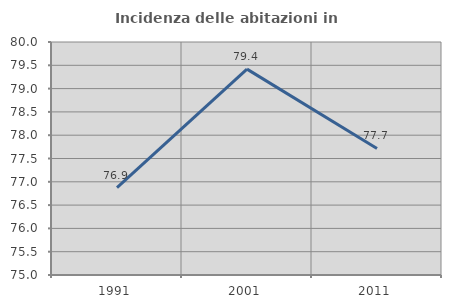
| Category | Incidenza delle abitazioni in proprietà  |
|---|---|
| 1991.0 | 76.875 |
| 2001.0 | 79.418 |
| 2011.0 | 77.715 |